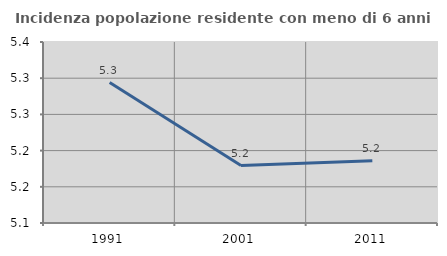
| Category | Incidenza popolazione residente con meno di 6 anni |
|---|---|
| 1991.0 | 5.294 |
| 2001.0 | 5.179 |
| 2011.0 | 5.186 |